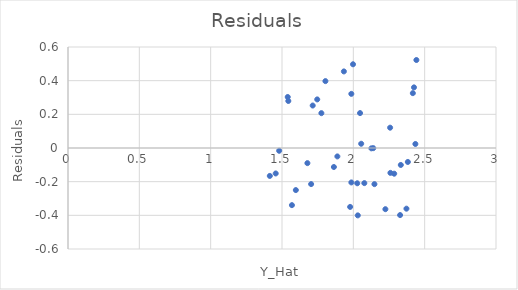
| Category | Residuals |
|---|---|
| 1.9977602258714084 | 0.497 |
| 2.417066404384353 | 0.326 |
| 1.5970044257565406 | -0.25 |
| 1.4559330149126728 | -0.151 |
| 2.2246547371269703 | -0.363 |
| 2.077053360609784 | -0.209 |
| 1.7151897432237433 | 0.252 |
| 2.3722724456361384 | -0.36 |
| 2.027453054964189 | -0.21 |
| 1.8880695435410246 | -0.05 |
| 2.0551225582611323 | 0.025 |
| 2.4420275894839705 | 0.523 |
| 2.0470544232320274 | 0.207 |
| 1.9859799278216503 | 0.322 |
| 2.3820768384156397 | -0.083 |
| 1.7759817004291167 | 0.207 |
| 1.569575261649205 | -0.339 |
| 1.7469293074986811 | 0.289 |
| 1.540135835192609 | 0.303 |
| 1.9861821895885732 | -0.205 |
| 1.8636920684514502 | -0.113 |
| 1.5443301706230423 | 0.279 |
| 1.9337462949834172 | 0.455 |
| 1.4801477181131497 | -0.017 |
| 2.4349298408197164 | 0.024 |
| 2.259981083064167 | -0.148 |
| 1.4145695928858766 | -0.166 |
| 1.9775699662200565 | -0.35 |
| 2.2578609217028633 | 0.121 |
| 2.0311851589298238 | -0.4 |
| 2.147878950999233 | -0.215 |
| 1.6780357197839926 | -0.09 |
| 2.425169670213151 | 0.36 |
| 2.1397242931359255 | -0.001 |
| 2.2864547597811127 | -0.153 |
| 1.8043414292734463 | 0.397 |
| 2.126572676780585 | -0.002 |
| 2.332764055967636 | -0.101 |
| 2.327735610843745 | -0.398 |
| 1.7041854753752286 | -0.214 |